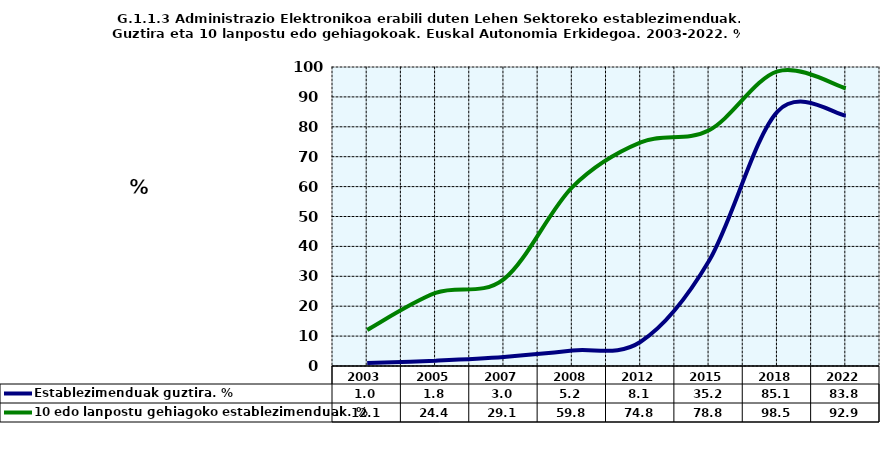
| Category | Establezimenduak guztira. % | 10 edo lanpostu gehiagoko establezimenduak. % |
|---|---|---|
| 2003.0 | 0.969 | 12.077 |
| 2005.0 | 1.791 | 24.444 |
| 2007.0 | 3.033 | 29.082 |
| 2008.0 | 5.176 | 59.848 |
| 2012.0 | 8.118 | 74.8 |
| 2015.0 | 35.191 | 78.832 |
| 2018.0 | 85.112 | 98.519 |
| 2022.0 | 83.771 | 92.908 |